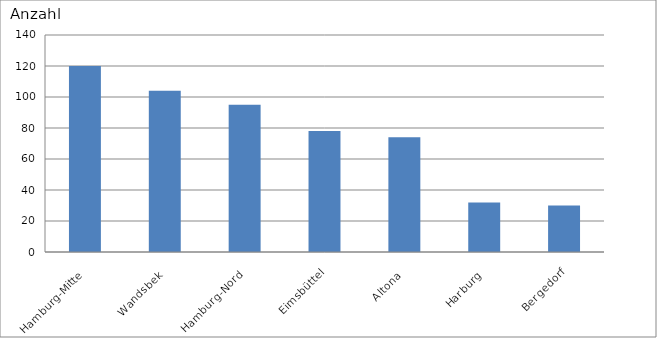
| Category | Hamburg-Mitte Wandsbek Hamburg-Nord Eimsbüttel Altona Harburg Bergedorf |
|---|---|
| Hamburg-Mitte | 120 |
| Wandsbek | 104 |
| Hamburg-Nord | 95 |
| Eimsbüttel | 78 |
| Altona | 74 |
| Harburg | 32 |
| Bergedorf | 30 |